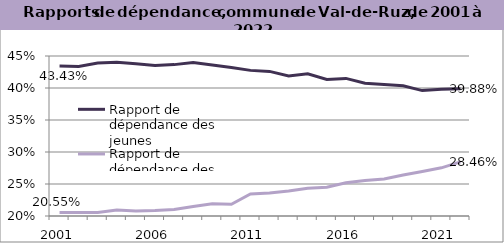
| Category | Rapport de dépendance des jeunes | Rapport de dépendance des personnes âgées |
|---|---|---|
| 2001.0 | 0.434 | 0.206 |
| 2002.0 | 0.434 | 0.205 |
| 2003.0 | 0.439 | 0.205 |
| 2004.0 | 0.44 | 0.21 |
| 2005.0 | 0.438 | 0.208 |
| 2006.0 | 0.435 | 0.209 |
| 2007.0 | 0.437 | 0.21 |
| 2008.0 | 0.44 | 0.215 |
| 2009.0 | 0.436 | 0.219 |
| 2010.0 | 0.432 | 0.218 |
| 2011.0 | 0.428 | 0.234 |
| 2012.0 | 0.426 | 0.236 |
| 2013.0 | 0.419 | 0.239 |
| 2014.0 | 0.422 | 0.243 |
| 2015.0 | 0.413 | 0.245 |
| 2016.0 | 0.415 | 0.252 |
| 2017.0 | 0.408 | 0.255 |
| 2018.0 | 0.406 | 0.258 |
| 2019.0 | 0.403 | 0.264 |
| 2020.0 | 0.396 | 0.27 |
| 2021.0 | 0.398 | 0.275 |
| 2022.0 | 0.399 | 0.285 |